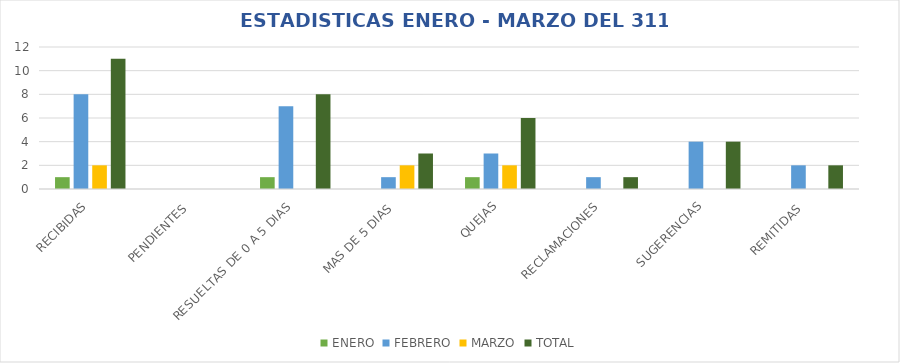
| Category | ENERO | FEBRERO | MARZO | TOTAL |
|---|---|---|---|---|
| RECIBIDAS | 1 | 8 | 2 | 11 |
| PENDIENTES  | 0 | 0 | 0 | 0 |
| RESUELTAS DE 0 A 5 DIAS  | 1 | 7 | 0 | 8 |
| MAS DE 5 DIAS  | 0 | 1 | 2 | 3 |
| QUEJAS | 1 | 3 | 2 | 6 |
| RECLAMACIONES | 0 | 1 | 0 | 1 |
| SUGERENCIAS | 0 | 4 | 0 | 4 |
| REMITIDAS  | 0 | 2 | 0 | 2 |